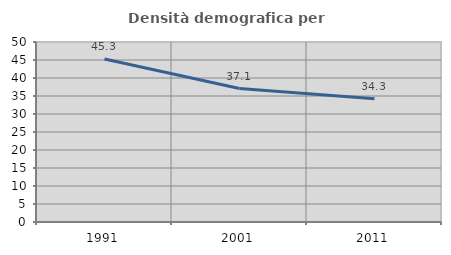
| Category | Densità demografica |
|---|---|
| 1991.0 | 45.291 |
| 2001.0 | 37.066 |
| 2011.0 | 34.254 |